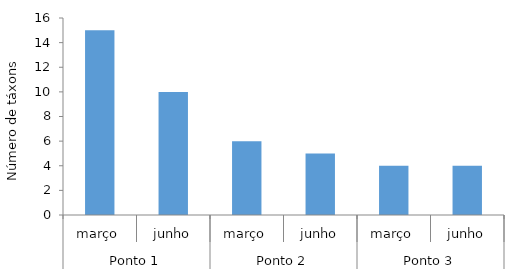
| Category | Series 0 |
|---|---|
| 0 | 15 |
| 1 | 10 |
| 2 | 6 |
| 3 | 5 |
| 4 | 4 |
| 5 | 4 |